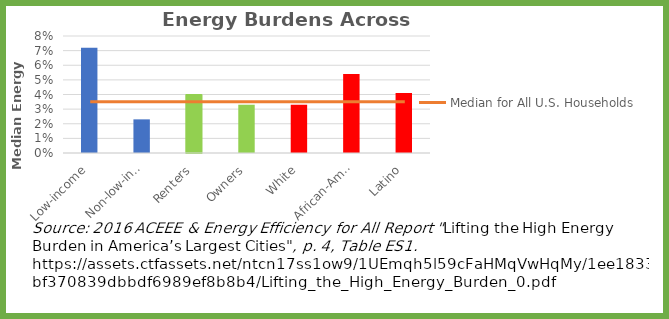
| Category | Series 0 |
|---|---|
| Low-income | 0.072 |
| Non-low-income | 0.023 |
| Renters | 0.04 |
| Owners | 0.033 |
| White | 0.033 |
| African-American | 0.054 |
| Latino | 0.041 |